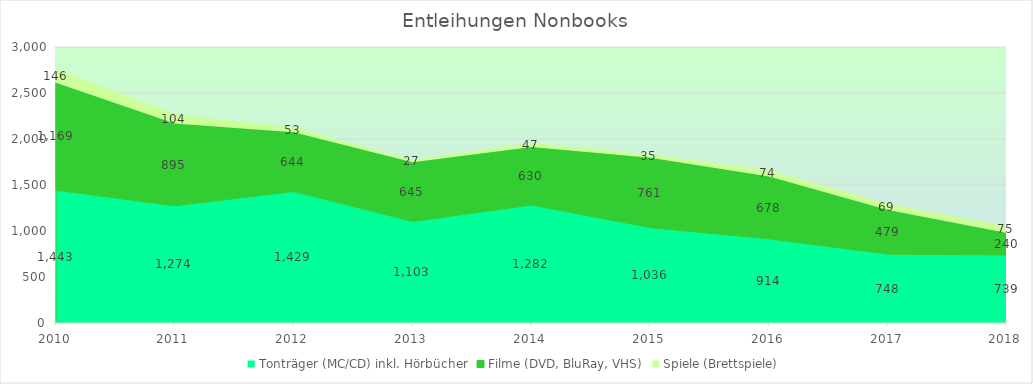
| Category | Tonträger (MC/CD) inkl. Hörbücher | Filme (DVD, BluRay, VHS) | Spiele (Brettspiele) |
|---|---|---|---|
| 2010.0 | 1443 | 1169 | 146 |
| 2011.0 | 1274 | 895 | 104 |
| 2012.0 | 1429 | 644 | 53 |
| 2013.0 | 1103 | 645 | 27 |
| 2014.0 | 1282 | 630 | 47 |
| 2015.0 | 1036 | 761 | 35 |
| 2016.0 | 914 | 678 | 74 |
| 2017.0 | 748 | 479 | 69 |
| 2018.0 | 739 | 240 | 75 |